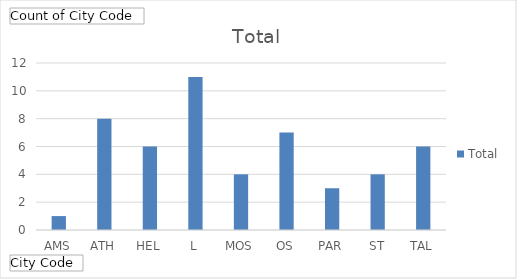
| Category | Total |
|---|---|
| AMS | 1 |
| ATH | 8 |
| HEL | 6 |
| L | 11 |
| MOS | 4 |
| OS | 7 |
| PAR | 3 |
| ST | 4 |
| TAL | 6 |